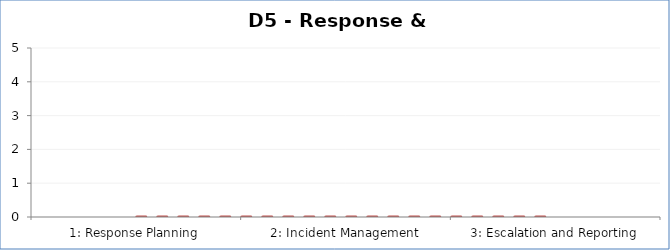
| Category | Assessment Factor Maturity |
|---|---|
| 1: Response Planning | 0 |
| 2: Incident Management | 0 |
| 3: Escalation and Reporting | 0 |